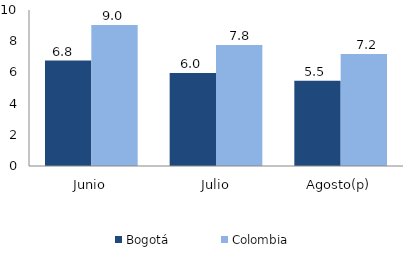
| Category | Bogotá | Colombia |
|---|---|---|
| Junio | 6.758 | 9.046 |
| Julio | 5.961 | 7.756 |
| Agosto(p) | 5.46 | 7.182 |